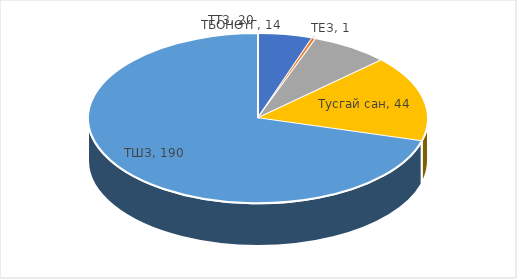
| Category | Total |
|---|---|
| ТБОНӨҮГ | 14 |
| ТЕЗ | 1 |
| ТТЗ | 20 |
| Тусгай сан | 44 |
| ТШЗ | 190 |